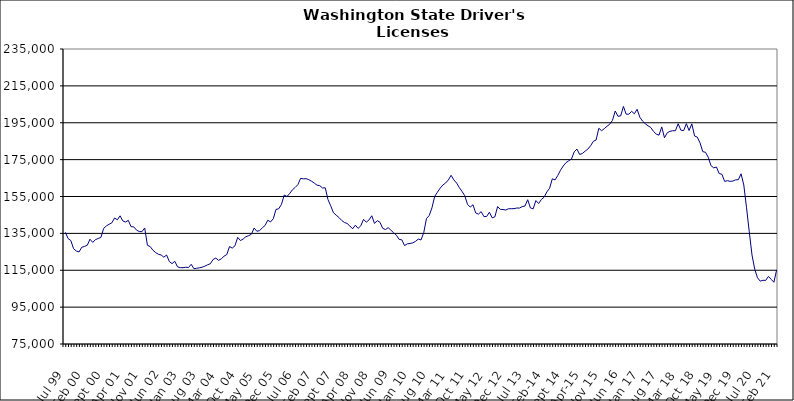
| Category | Series 0 |
|---|---|
| Jul 99 | 135560 |
| Aug 99 | 132182 |
| Sep 99 | 131104 |
| Oct 99 | 126694 |
| Nov 99 | 125425 |
| Dec 99 | 124927 |
| Jan 00 | 127499 |
| Feb 00 | 127927 |
| Mar 00 | 128547 |
| Apr 00 | 131834 |
| May 00 | 130120 |
| Jun 00 | 131595 |
| Jul 00 | 132236 |
| Aug 00 | 132819 |
| Sep 00 | 137711 |
| Oct 00 | 139063 |
| Nov 00 | 139952 |
| Dec 00 | 140732 |
| Jan 01 | 143338 |
| Feb 01 | 142359 |
| Mar 01 | 144523 |
| Apr 01 | 141758 |
| May 01 | 141135 |
| Jun 01 | 142064 |
| Jul 01 | 138646 |
| Aug 01 | 138530 |
| Sep 01 | 136784 |
| Oct 01 | 135996 |
| Nov 01 | 135917 |
| Dec 01 | 137940 |
| Jan 02 | 128531 |
| Feb 02 | 127848 |
| Mar 02 | 125876 |
| Apr 02 | 124595 |
| May 02 | 123660 |
| Jun 02 | 123282 |
| Jul 02 | 122089 |
| Aug 02 | 123279 |
| Sep 02 | 119727 |
| Oct 02 | 118588 |
| Nov 02 | 119854 |
| Dec 02 | 116851 |
| Jan 03 | 116407 |
| Feb 03 | 116382 |
| Mar 03 | 116648 |
| Apr 03 | 116471 |
| May 03 | 118231 |
| Jun 03 | 115831 |
| Jul 03 | 116082 |
| Aug 03 | 116341 |
| Sep 03 | 116653 |
| Oct 03 | 117212 |
| Nov 03 | 117962 |
| Dec 03 | 118542 |
| Jan 04 | 120817 |
| Feb 04 | 121617 |
| Mar 04 | 120369 |
| Apr 04 | 121200 |
| May 04 | 122609 |
| Jun 04 | 123484 |
| Jul 04 | 127844 |
| Aug 04 | 127025 |
| Sep 04 | 128273 |
| Oct 04 | 132853 |
| Nov 04 | 131106 |
| Dec 04 | 131935 |
| Jan 05 | 133205 |
| Feb 05 | 133736 |
| Mar 05 | 134528 |
| Apr 05 | 137889 |
| May 05 | 136130 |
| Jun 05 | 136523 |
| Jul 05 | 137997 |
| Aug 05 | 139294 |
| Sep 05 | 142140 |
| Oct 05 | 141192 |
| Nov 05 | 142937 |
| Dec 05 | 148013 |
| Jan 06 | 148341 |
| Feb 06 | 150744 |
| Mar 06 | 155794 |
| Apr 06 | 154984 |
| May 06 | 156651 |
| Jun 06 | 158638 |
| Jul 06 | 159911 |
| Aug 06 | 161445 |
| Sep 06 | 164852 |
| Oct 06 | 164570 |
| Nov 06 | 164679 |
| Dec 06 | 164127 |
| Jan 07 | 163271 |
| Feb 07 | 162273 |
| Mar 07 | 161140 |
| Apr 07 | 160860 |
| May 07 | 159633 |
| Jun 07 | 159724 |
| Jul 07 | 153303 |
| Aug 07 | 149939 |
| Sep 07 | 146172 |
| Oct 07 | 144876 |
| Nov 07 | 143613 |
| Dec 07 | 142022 |
| Jan 08 | 140909 |
| Feb 08 | 140368 |
| Mar 08 | 138998 |
| Apr 08 | 137471 |
| May 08 | 139453 |
| Jun 08 | 137680 |
| Jul 08 | 139120 |
| Aug 08 | 142612 |
| Sep-08 | 141071 |
| Oct 08 | 142313 |
| Nov 08 | 144556 |
| Dec 08 | 140394 |
| Jan 09 | 141903 |
| Feb 09 | 141036 |
| Mar 09 | 137751 |
| Apr 09 | 137060 |
| May 09 | 138101 |
| Jun 09 | 136739 |
| Jul 09 | 135317 |
| Aug 09 | 134020 |
| Sep 09 | 131756 |
| Oct 09 | 131488 |
| Nov 09 | 128370 |
| Dec 09 | 129323 |
| Jan 10 | 129531 |
| Feb 10 | 129848 |
| Mar 10 | 130654 |
| Apr 10 | 131929 |
| May 10 | 131429 |
| Jun 10 | 135357 |
| Jul 10 | 143032 |
| Aug 10 | 144686 |
| Sep 10 | 148856 |
| Oct 10 | 155042 |
| Nov 10 | 157328 |
| Dec 10 | 159501 |
| Jan 11 | 161221 |
| Feb 11 | 162312 |
| Mar 11 | 163996 |
| Apr 11 | 166495 |
| May 11 | 164040 |
| Jun 11 | 162324 |
| Jul 11 | 159862 |
| Aug 11 | 157738 |
| Sep 11 | 155430 |
| Oct 11 | 150762 |
| Nov 11 | 149255 |
| Dec 11 | 150533 |
| Jan 12 | 146068 |
| Feb 12 | 145446 |
| Mar 12 | 146788 |
| Apr 12 | 144110 |
| May 12 | 144162 |
| Jun 12 | 146482 |
| Jul 12 | 143445 |
| Aug 12 | 143950 |
| Sep 12 | 149520 |
| Oct 12 | 148033 |
| Nov 12 | 147926 |
| Dec 12 | 147674 |
| Jan 13 | 148360 |
| Feb-13 | 148388 |
| Mar-13 | 148414 |
| Apr 13 | 148749 |
| May 13 | 148735 |
| Jun-13 | 149521 |
| Jul 13 | 149837 |
| Aug 13 | 153252 |
| Sep 13 | 148803 |
| Oct 13 | 148315 |
| Nov 13 | 152804 |
| Dec 13 | 151209 |
| Jan 14 | 153357 |
| Feb-14 | 154608 |
| Mar 14 | 157479 |
| Apr 14 | 159441 |
| May 14 | 164591 |
| Jun 14 | 163995 |
| Jul-14 | 166411 |
| Aug-14 | 169272 |
| Sep 14 | 171565 |
| Oct 14 | 173335 |
| Nov 14 | 174406 |
| Dec 14 | 175302 |
| Jan 15 | 179204 |
| Feb 15 | 180737 |
| Mar 15 | 177810 |
| Apr-15 | 178331 |
| May 15 | 179601 |
| Jun-15 | 180729 |
| Jul 15 | 182540 |
| Aug 15 | 184924 |
| Sep 15 | 185620 |
| Oct 15 | 192002 |
| Nov 15 | 190681 |
| Dec 15 | 191795 |
| Jan 16 | 193132 |
| Feb 16 | 194206 |
| Mar 16 | 196319 |
| Apr 16 | 201373 |
| May 16 | 198500 |
| Jun 16 | 198743 |
| Jul 16 | 203841 |
| Aug 16 | 199630 |
| Sep 16 | 199655 |
| Oct 16 | 201181 |
| Nov 16 | 199888 |
| Dec 16 | 202304 |
| Jan 17 | 197977 |
| Feb 17 | 195889 |
| Mar 17 | 194438 |
| Apr 17 | 193335 |
| May 17 | 192430 |
| Jun 17 | 190298 |
| Jul 17 | 188832 |
| Aug 17 | 188264 |
| Sep 17 | 192738 |
| Oct 17 | 186856 |
| Nov 17 | 189537 |
| Dec 17 | 190341 |
| Jan 18 | 190670 |
| Feb 18 | 190645 |
| Mar 18 | 194476 |
| Apr 18 | 190971 |
| May 18 | 190707 |
| Jun 18 | 194516 |
| Jul 18 | 190783 |
| Aug 18 | 194390 |
| Sep 18 | 187831 |
| Oct 18 | 187188 |
| Nov 18 | 184054 |
| Dec 18 | 179347 |
| Jan 19 | 178958 |
| Feb 19 | 176289 |
| Mar 19 | 171747 |
| Apr 19 | 170532 |
| May 19 | 170967 |
| Jun 19 | 167444 |
| Jul 19 | 167059 |
| Aug 19 | 163194 |
| Sep 19 | 163599 |
| Oct 19 | 163212 |
| Nov 19 | 163388 |
| Dec 19 | 164024 |
| Jan 20 | 164114 |
| Feb 20 | 167320 |
| Mar 20 | 161221 |
| Apr 20 | 148866 |
| May 20 | 135821 |
| Jun 20 | 123252 |
| Jul 20 | 115526 |
| Aug 20 | 110940 |
| Sep 20 | 109099 |
| Oct 20 | 109566 |
| Nov 20 | 109488 |
| Dec 20 | 111658 |
| Jan 21 | 110070 |
| Feb 21 | 108491 |
| Mar 21 | 115176 |